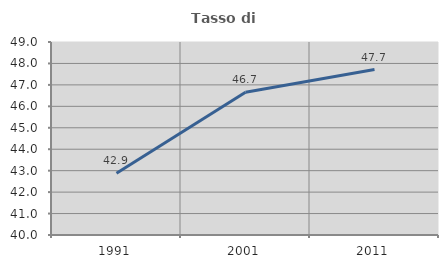
| Category | Tasso di occupazione   |
|---|---|
| 1991.0 | 42.88 |
| 2001.0 | 46.654 |
| 2011.0 | 47.714 |